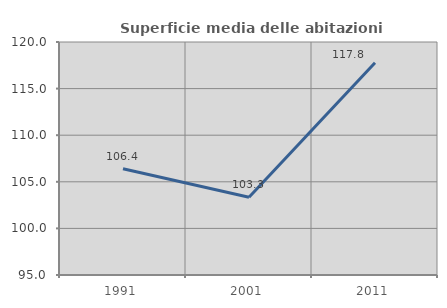
| Category | Superficie media delle abitazioni occupate |
|---|---|
| 1991.0 | 106.401 |
| 2001.0 | 103.333 |
| 2011.0 | 117.772 |